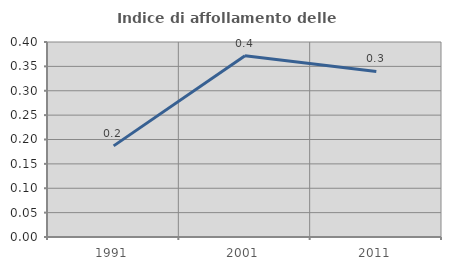
| Category | Indice di affollamento delle abitazioni  |
|---|---|
| 1991.0 | 0.187 |
| 2001.0 | 0.372 |
| 2011.0 | 0.34 |